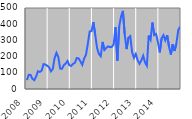
| Category | Series 0 |
|---|---|
| 2008.0 | 54.994 |
| 2.0 | 87.474 |
| 3.0 | 86.135 |
| 4.0 | 62.645 |
| 5.0 | 54.704 |
| 6.0 | 77.27 |
| 7.0 | 109.748 |
| 8.0 | 105.165 |
| 9.0 | 113.684 |
| 10.0 | 153.785 |
| 11.0 | 150.899 |
| 12.0 | 143.498 |
| 2009.0 | 134.647 |
| 2.0 | 108.545 |
| 3.0 | 123.293 |
| 4.0 | 190.728 |
| 5.0 | 223.339 |
| 6.0 | 197.686 |
| 7.0 | 126.216 |
| 8.0 | 124.556 |
| 9.0 | 147.014 |
| 10.0 | 157.018 |
| 11.0 | 172.969 |
| 12.0 | 146.812 |
| 2010.0 | 142.524 |
| 2.0 | 155.201 |
| 3.0 | 161.552 |
| 4.0 | 191.215 |
| 5.0 | 189.006 |
| 6.0 | 170.361 |
| 7.0 | 149.043 |
| 8.0 | 187.575 |
| 9.0 | 211.446 |
| 10.0 | 279.016 |
| 11.0 | 354.827 |
| 12.0 | 357.983 |
| 2011.0 | 413.285 |
| 2.0 | 336.333 |
| 3.0 | 253.611 |
| 4.0 | 216.077 |
| 5.0 | 202.149 |
| 6.0 | 290.811 |
| 7.0 | 240.867 |
| 8.0 | 253.335 |
| 9.0 | 263.473 |
| 10.0 | 258.282 |
| 11.0 | 259.981 |
| 12.0 | 275.644 |
| 2012.0 | 381.511 |
| 2.0 | 175.241 |
| 3.0 | 385.481 |
| 4.0 | 447.996 |
| 5.0 | 482.146 |
| 6.0 | 336.825 |
| 7.0 | 246.447 |
| 8.0 | 316.331 |
| 9.0 | 326.315 |
| 10.0 | 226.146 |
| 11.0 | 192.014 |
| 12.0 | 216.272 |
| 2013.0 | 177.478 |
| 2.0 | 155.586 |
| 3.0 | 176.504 |
| 4.0 | 205.318 |
| 5.0 | 164.253 |
| 6.0 | 143.867 |
| 7.0 | 329.606 |
| 8.0 | 304.567 |
| 9.0 | 410.034 |
| 10.0 | 332.622 |
| 11.0 | 339.949 |
| 12.0 | 288.901 |
| 2014.0 | 226.303 |
| 2.0 | 313.438 |
| 3.0 | 332.37 |
| 4.0 | 300.388 |
| 5.0 | 332.83 |
| 6.0 | 261.766 |
| 7.0 | 212.442 |
| 8.0 | 276.981 |
| 9.0 | 234.86 |
| 10.0 | 280.466 |
| 11.0 | 363.546 |
| 12.0 | 385.046 |